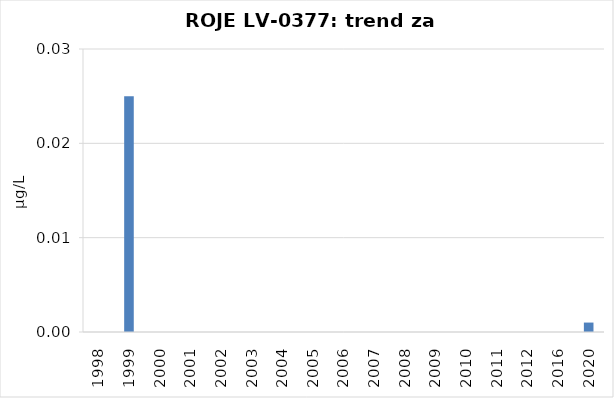
| Category | Vsota |
|---|---|
| 1998 | 0 |
| 1999 | 0.025 |
| 2000 | 0 |
| 2001 | 0 |
| 2002 | 0 |
| 2003 | 0 |
| 2004 | 0 |
| 2005 | 0 |
| 2006 | 0 |
| 2007 | 0 |
| 2008 | 0 |
| 2009 | 0 |
| 2010 | 0 |
| 2011 | 0 |
| 2012 | 0 |
| 2016 | 0 |
| 2020 | 0.001 |